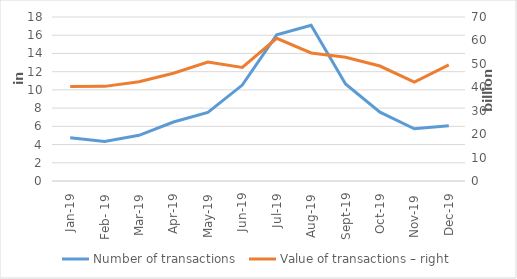
| Category | Number of transactions  |
|---|---|
| sij.19 | 4740654 |
| Feb- 19 | 4345566 |
| ožu.19 | 5018204 |
| Apr-19 | 6477561 |
| svi.19 | 7530362 |
| lip.19 | 10527517 |
| srp.19 | 16048224 |
| kol.19 | 17093430 |
| ruj.19 | 10649876 |
| lis.19 | 7549405 |
| stu.19 | 5726743 |
| Dec-19 | 6058096 |